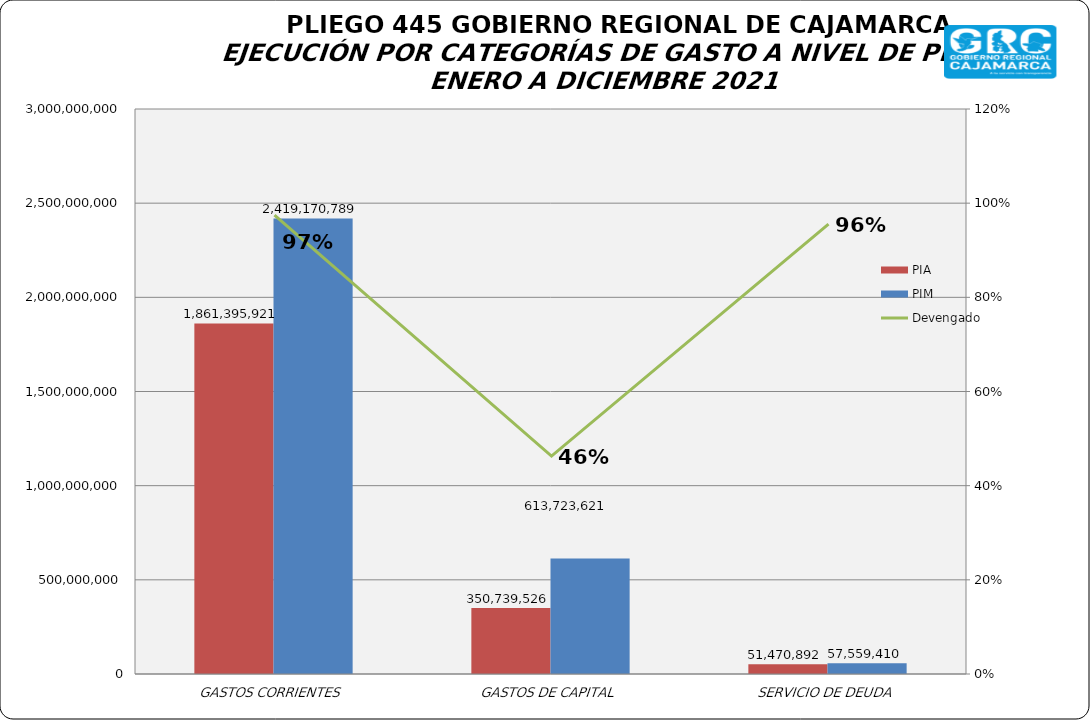
| Category | PIA | PIM |
|---|---|---|
| GASTOS CORRIENTES | 1861395921 | 2419170789 |
| GASTOS DE CAPITAL | 350739526 | 613723621 |
| SERVICIO DE DEUDA | 51470892 | 57559410 |